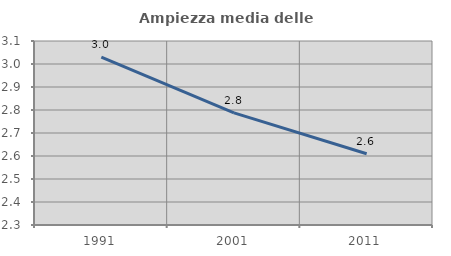
| Category | Ampiezza media delle famiglie |
|---|---|
| 1991.0 | 3.03 |
| 2001.0 | 2.788 |
| 2011.0 | 2.61 |